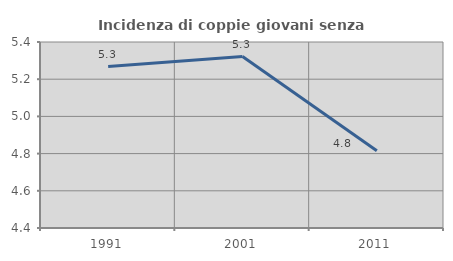
| Category | Incidenza di coppie giovani senza figli |
|---|---|
| 1991.0 | 5.268 |
| 2001.0 | 5.322 |
| 2011.0 | 4.815 |